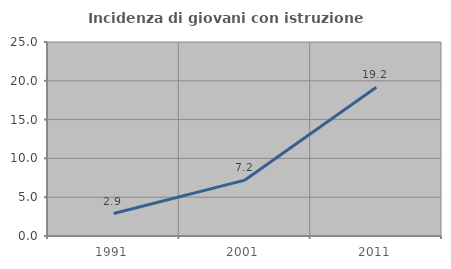
| Category | Incidenza di giovani con istruzione universitaria |
|---|---|
| 1991.0 | 2.894 |
| 2001.0 | 7.204 |
| 2011.0 | 19.167 |